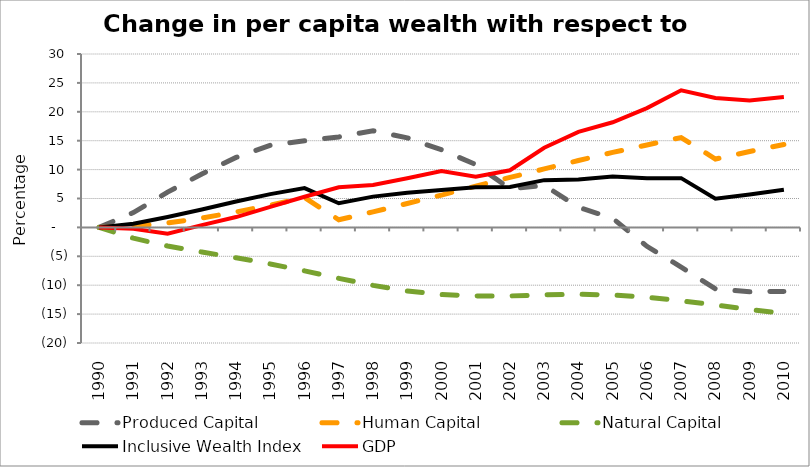
| Category | Produced Capital  | Human Capital | Natural Capital | Inclusive Wealth Index | GDP |
|---|---|---|---|---|---|
| 1990.0 | 0 | 0 | 0 | 0 | 0 |
| 1991.0 | 2.565 | 0.198 | -1.867 | 0.648 | -0.223 |
| 1992.0 | 6.1 | 0.754 | -3.222 | 1.811 | -1.084 |
| 1993.0 | 9.245 | 1.611 | -4.255 | 3.109 | 0.401 |
| 1994.0 | 12.109 | 2.668 | -5.25 | 4.482 | 1.789 |
| 1995.0 | 14.2 | 3.859 | -6.323 | 5.759 | 3.546 |
| 1996.0 | 14.998 | 5.158 | -7.519 | 6.793 | 5.306 |
| 1997.0 | 15.652 | 1.316 | -8.814 | 4.18 | 6.935 |
| 1998.0 | 16.711 | 2.688 | -10.027 | 5.328 | 7.328 |
| 1999.0 | 15.489 | 4.135 | -11.005 | 5.992 | 8.49 |
| 2000.0 | 13.422 | 5.595 | -11.613 | 6.483 | 9.769 |
| 2001.0 | 10.875 | 7.143 | -11.877 | 6.941 | 8.786 |
| 2002.0 | 6.677 | 8.645 | -11.858 | 6.985 | 9.888 |
| 2003.0 | 7.287 | 10.121 | -11.679 | 8.177 | 13.775 |
| 2004.0 | 3.488 | 11.57 | -11.574 | 8.285 | 16.531 |
| 2005.0 | 1.568 | 12.979 | -11.684 | 8.805 | 18.191 |
| 2006.0 | -3.274 | 14.257 | -12.085 | 8.513 | 20.636 |
| 2007.0 | -6.864 | 15.547 | -12.688 | 8.519 | 23.719 |
| 2008.0 | -10.615 | 11.834 | -13.425 | 4.969 | 22.404 |
| 2009.0 | -11.142 | 13.129 | -14.189 | 5.706 | 21.973 |
| 2010.0 | -11.073 | 14.335 | -14.909 | 6.527 | 22.555 |